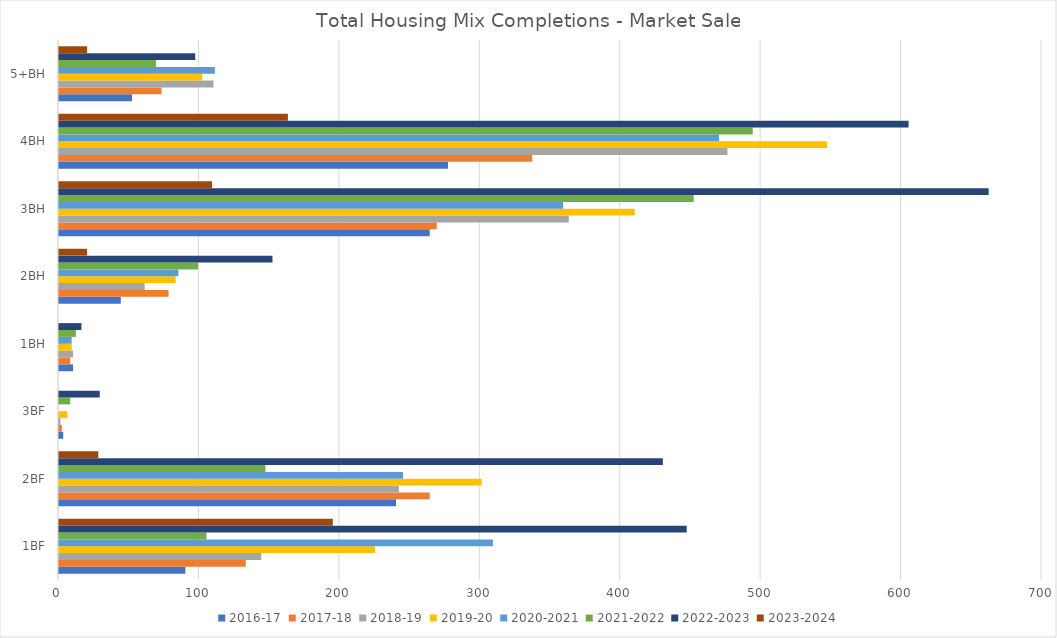
| Category | 2016-17 | 2017-18 | 2018-19 | 2019-20 | 2020-2021 | 2021-2022 | 2022-2023 | 2023-2024 |
|---|---|---|---|---|---|---|---|---|
| 1BF | 90 | 133 | 144 | 225 | 309 | 105 | 447 | 195 |
| 2BF | 240 | 264 | 242 | 301 | 245 | 147 | 430 | 28 |
| 3BF | 3 | 2 | 1 | 6 | 0 | 8 | 29 | 0 |
| 1BH | 10 | 8 | 10 | 9 | 9 | 12 | 16 | 0 |
| 2BH | 44 | 78 | 61 | 83 | 85 | 99 | 152 | 20 |
| 3BH | 264 | 269 | 363 | 410 | 359 | 452 | 662 | 109 |
| 4BH | 277 | 337 | 476 | 547 | 470 | 494 | 605 | 163 |
| 5+BH | 52 | 73 | 110 | 102 | 111 | 69 | 97 | 20 |